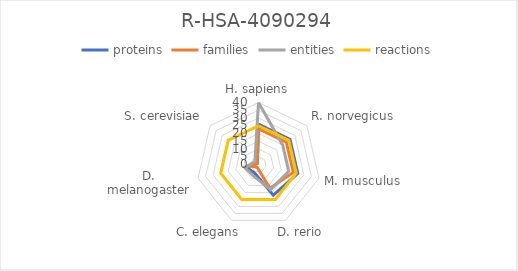
| Category | proteins | families | entities | reactions |
|---|---|---|---|---|
| H. sapiens | 26 | 23 | 40 | 25 |
| R. norvegicus | 26 | 23 | 20 | 25 |
| M. musculus | 26 | 23 | 20 | 25 |
| D. rerio | 22 | 17 | 18 | 25 |
| C. elegans | 6 | 2 | 8 | 25 |
| D. melanogaster | 8 | 5 | 9 | 25 |
| S. cerevisiae | 1 | 1 | 3 | 25 |